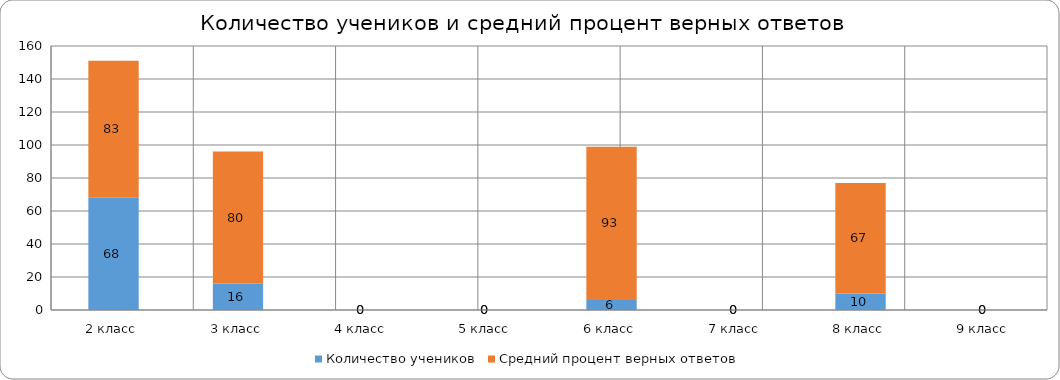
| Category | Количество учеников | Средний процент верных ответов |
|---|---|---|
| 2 класс | 68 | 83 |
| 3 класс | 16 | 80 |
| 4 класс | 0 | 0 |
| 5 класс | 0 | 0 |
| 6 класс | 6 | 93 |
| 7 класс | 0 | 0 |
| 8 класс | 10 | 67 |
| 9 класс | 0 | 0 |